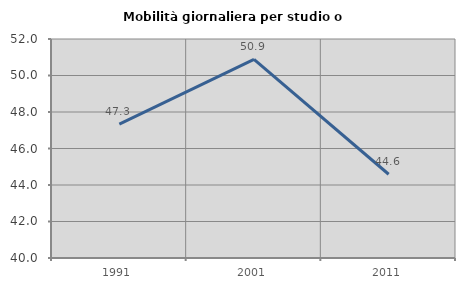
| Category | Mobilità giornaliera per studio o lavoro |
|---|---|
| 1991.0 | 47.33 |
| 2001.0 | 50.888 |
| 2011.0 | 44.589 |